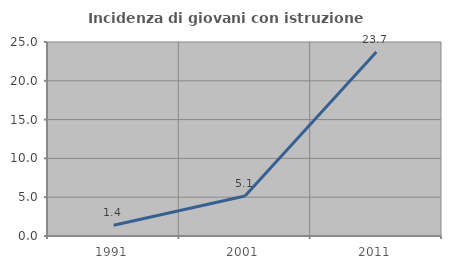
| Category | Incidenza di giovani con istruzione universitaria |
|---|---|
| 1991.0 | 1.379 |
| 2001.0 | 5.147 |
| 2011.0 | 23.711 |